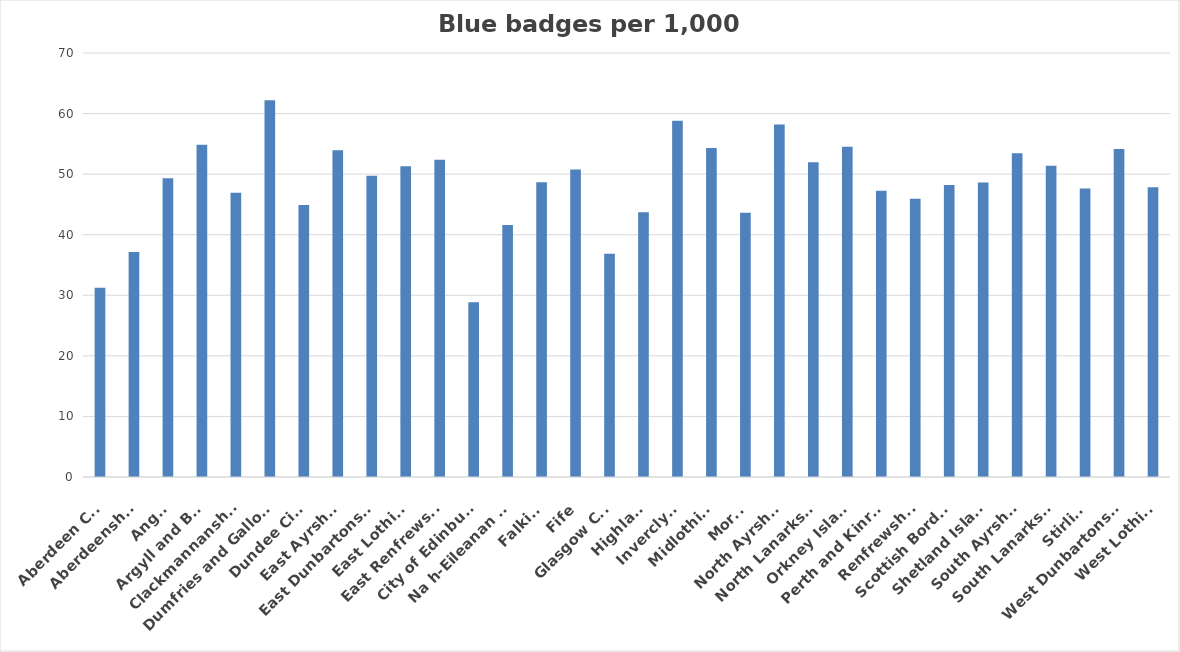
| Category | Series 0 |
|---|---|
| Aberdeen City | 31.254 |
| Aberdeenshire | 37.154 |
| Angus | 49.327 |
| Argyll and Bute | 54.852 |
| Clackmannanshire | 46.929 |
| Dumfries and Galloway | 62.196 |
| Dundee City | 44.886 |
| East Ayrshire | 53.956 |
| East Dunbartonshire | 49.729 |
| East Lothian | 51.316 |
| East Renfrewshire | 52.384 |
| City of Edinburgh | 28.831 |
| Na h-Eileanan Siar | 41.623 |
| Falkirk | 48.661 |
| Fife | 50.782 |
| Glasgow City | 36.84 |
| Highland | 43.703 |
| Inverclyde | 58.811 |
| Midlothian | 54.31 |
| Moray | 43.611 |
| North Ayrshire | 58.19 |
| North Lanarkshire | 51.97 |
| Orkney Islands | 54.509 |
| Perth and Kinross | 47.245 |
| Renfrewshire | 45.933 |
| Scottish Borders | 48.204 |
| Shetland Islands | 48.623 |
| South Ayrshire | 53.433 |
| South Lanarkshire | 51.375 |
| Stirling | 47.619 |
| West Dunbartonshire | 54.166 |
| West Lothian | 47.846 |